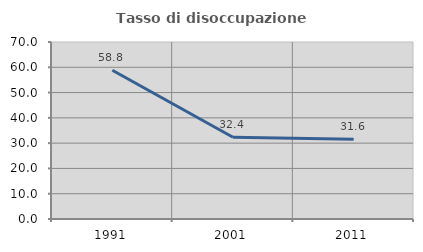
| Category | Tasso di disoccupazione giovanile  |
|---|---|
| 1991.0 | 58.824 |
| 2001.0 | 32.353 |
| 2011.0 | 31.579 |